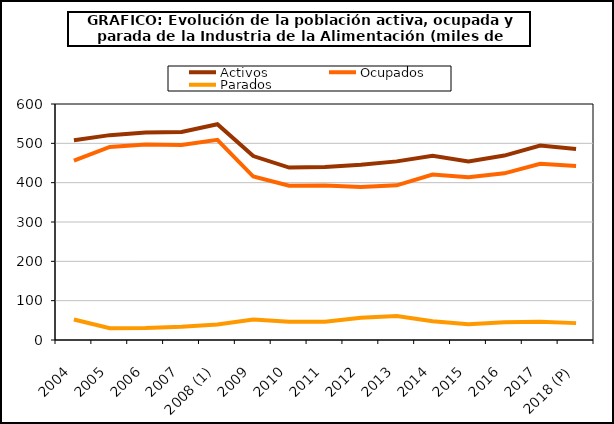
| Category | Activos | Ocupados | Parados |
|---|---|---|---|
| 2004 | 508.05 | 455.9 | 52.175 |
| 2005 | 520.85 | 490.7 | 30.15 |
| 2006 | 527.375 | 496.9 | 30.475 |
| 2007 | 529 | 495.6 | 33.4 |
| 2008 (1) | 548.65 | 509 | 39.7 |
| 2009 | 467.6 | 415.6 | 52 |
| 2010 | 438.425 | 392.275 | 46.2 |
| 2011 | 439.6 | 393.1 | 46.5 |
| 2012 | 445.725 | 388.925 | 56.8 |
| 2013 | 454.1 | 393.3 | 60.8 |
| 2014 | 468.5 | 420.7 | 47.8 |
| 2015 | 454.1 | 414 | 40.1 |
| 2016 | 468.925 | 423.675 | 45.25 |
| 2017 | 494.275 | 448.025 | 46.25 |
| 2018 (P) | 485.3 | 442.4 | 42.9 |